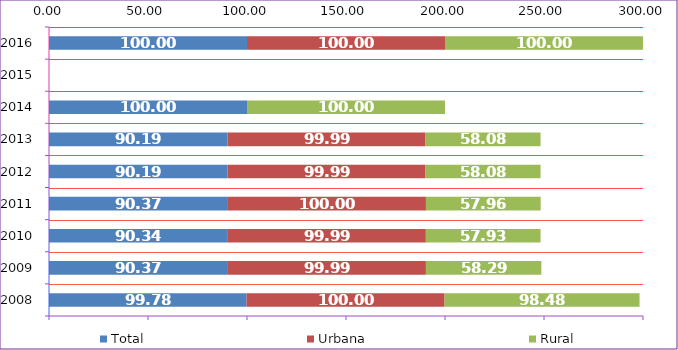
| Category | Total | Urbana | Rural |
|---|---|---|---|
| 2008.0 | 99.78 | 100 | 98.48 |
| 2009.0 | 90.37 | 99.99 | 58.29 |
| 2010.0 | 90.34 | 99.99 | 57.93 |
| 2011.0 | 90.37 | 100 | 57.96 |
| 2012.0 | 90.19 | 99.99 | 58.08 |
| 2013.0 | 90.19 | 99.99 | 58.08 |
| 2014.0 | 100 | 0 | 100 |
| 2015.0 | 0 | 0 | 0 |
| 2016.0 | 100 | 100 | 100 |